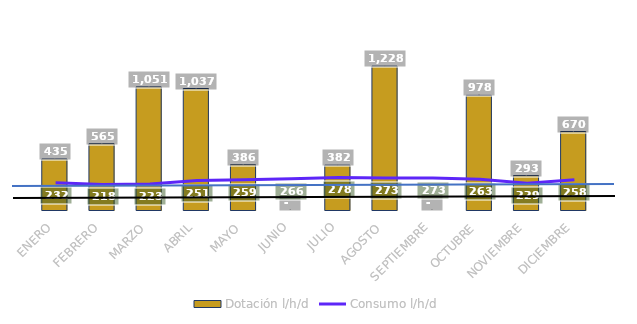
| Category | Dotación l/h/d |
|---|---|
| ENERO | 435.092 |
| FEBRERO | 565.295 |
| MARZO | 1050.831 |
| ABRIL | 1037.163 |
| MAYO | 385.8 |
| JUNIO | 0 |
| JULIO | 382.467 |
| AGOSTO | 1227.753 |
| SEPTIEMBRE | 0 |
| OCTUBRE | 978.476 |
| NOVIEMBRE | 293.435 |
| DICIEMBRE | 669.605 |